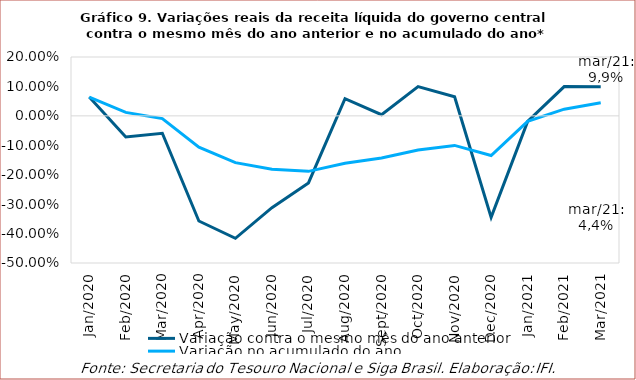
| Category | Variação contra o mesmo mês do ano anterior | Variação no acumulado do ano |
|---|---|---|
| 2020-01-01 | 0.064 | 0.064 |
| 2020-02-01 | -0.072 | 0.012 |
| 2020-03-01 | -0.059 | -0.009 |
| 2020-04-01 | -0.357 | -0.107 |
| 2020-05-01 | -0.416 | -0.159 |
| 2020-06-01 | -0.312 | -0.181 |
| 2020-07-01 | -0.228 | -0.189 |
| 2020-08-01 | 0.058 | -0.161 |
| 2020-09-01 | 0.004 | -0.143 |
| 2020-10-01 | 0.099 | -0.116 |
| 2020-11-01 | 0.065 | -0.1 |
| 2020-12-01 | -0.345 | -0.135 |
| 2021-01-01 | -0.019 | -0.019 |
| 2021-02-01 | 0.099 | 0.023 |
| 2021-03-01 | 0.099 | 0.044 |